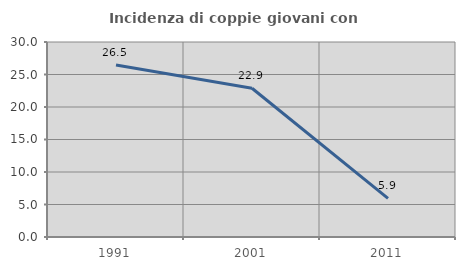
| Category | Incidenza di coppie giovani con figli |
|---|---|
| 1991.0 | 26.455 |
| 2001.0 | 22.886 |
| 2011.0 | 5.946 |